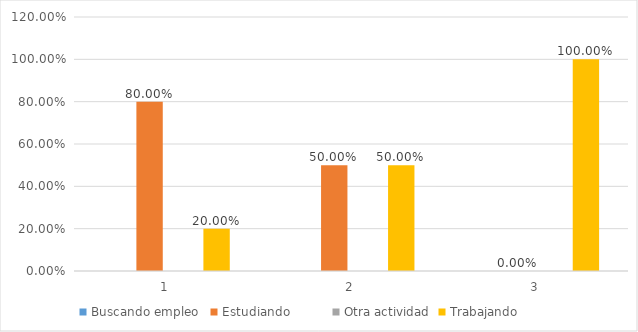
| Category | Buscando empleo  | Estudiando          | Otra actividad | Trabajando          |
|---|---|---|---|---|
| 0 | 0 | 0.8 | 0 | 0.2 |
| 1 | 0 | 0.5 | 0 | 0.5 |
| 2 | 0 | 0 | 0 | 1 |